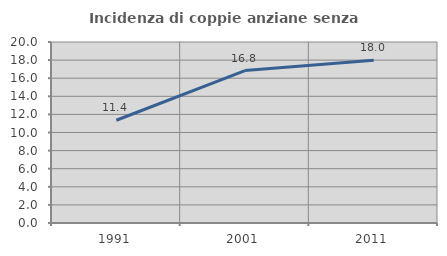
| Category | Incidenza di coppie anziane senza figli  |
|---|---|
| 1991.0 | 11.356 |
| 2001.0 | 16.845 |
| 2011.0 | 17.979 |